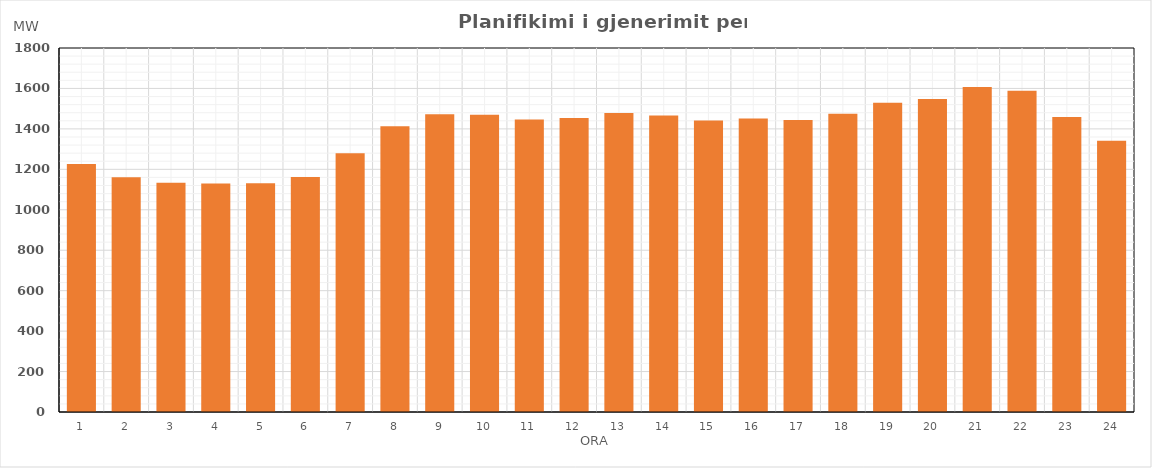
| Category | Max (MW) |
|---|---|
| 0 | 1226.632 |
| 1 | 1161.212 |
| 2 | 1133.719 |
| 3 | 1130.31 |
| 4 | 1131.679 |
| 5 | 1161.757 |
| 6 | 1280.086 |
| 7 | 1412.904 |
| 8 | 1472.811 |
| 9 | 1470.166 |
| 10 | 1446.671 |
| 11 | 1454.084 |
| 12 | 1478.717 |
| 13 | 1466.487 |
| 14 | 1441.164 |
| 15 | 1450.9 |
| 16 | 1444.112 |
| 17 | 1474.302 |
| 18 | 1529.337 |
| 19 | 1547.197 |
| 20 | 1607.634 |
| 21 | 1588.006 |
| 22 | 1458.825 |
| 23 | 1340.764 |